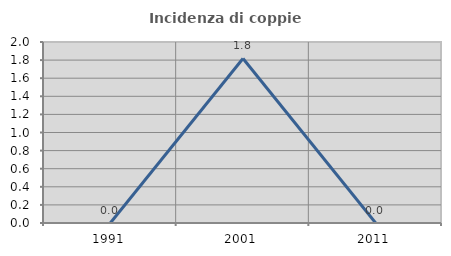
| Category | Incidenza di coppie miste |
|---|---|
| 1991.0 | 0 |
| 2001.0 | 1.818 |
| 2011.0 | 0 |